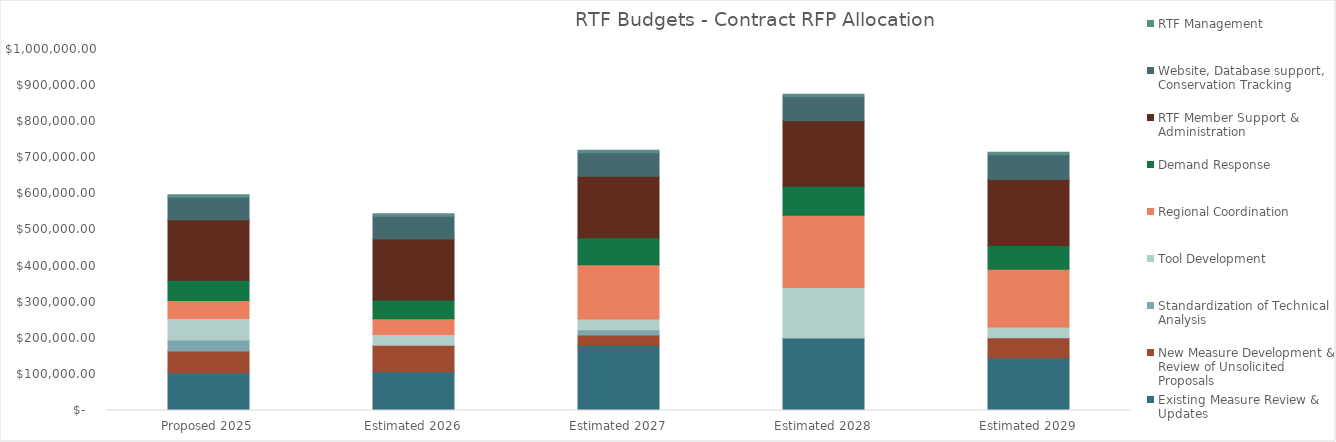
| Category | Existing Measure Review & Updates | New Measure Development & Review of Unsolicited Proposals | Standardization of Technical Analysis | Tool Development | Regional Coordination | Demand Response | RTF Member Support & Administration | Website, Database support, Conservation Tracking  | RTF Management |
|---|---|---|---|---|---|---|---|---|---|
| Proposed 2025 | 104500 | 60500 | 30000 | 60000 | 50000 | 55500 | 168200 | 61700 | 7000 |
| Estimated 2026 | 107350 | 73450 | 0 | 30000 | 43700 | 51300 | 169300 | 63200 | 7000 |
| Estimated 2027 | 179800 | 29000 | 15000 | 30000 | 150000 | 75000 | 170400 | 64800 | 7000 |
| Estimated 2028 | 200600 | 0 | 0 | 140000 | 200000 | 80900 | 181000 | 66400 | 7000 |
| Estimated 2029 | 146400 | 54900 | 0 | 30000 | 160000 | 66100 | 182700 | 68100 | 7000 |